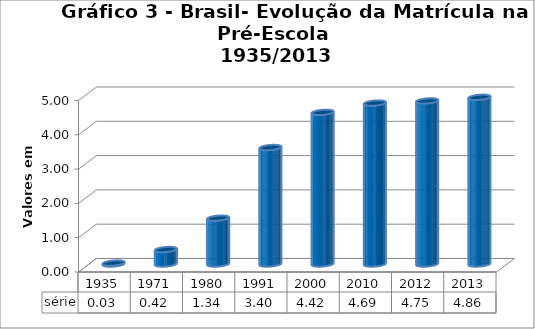
| Category | série |
|---|---|
| 1935.0 | 0.027 |
| 1971.0 | 0.422 |
| 1980.0 | 1.335 |
| 1991.0 | 3.396 |
| 2000.0 | 4.421 |
| 2010.0 | 4.692 |
| 2012.0 | 4.755 |
| 2013.0 | 4.86 |